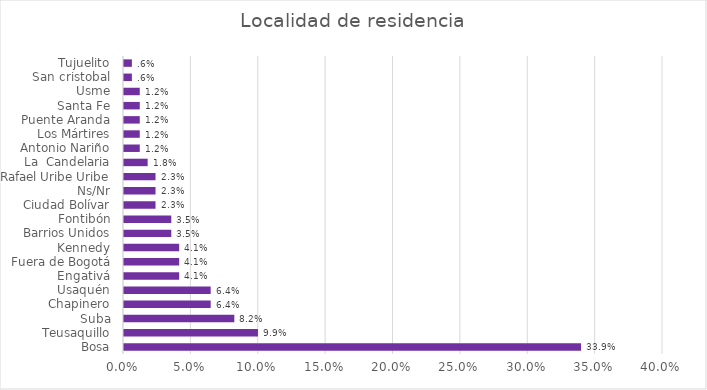
| Category | % del N de columna |
|---|---|
| Bosa | 0.339 |
| Teusaquillo | 0.099 |
| Suba | 0.082 |
| Chapinero | 0.064 |
| Usaquén | 0.064 |
| Engativá | 0.041 |
| Fuera de Bogotá | 0.041 |
| Kennedy | 0.041 |
| Barrios Unidos | 0.035 |
| Fontibón | 0.035 |
| Ciudad Bolívar | 0.023 |
| Ns/Nr | 0.023 |
| Rafael Uribe Uribe | 0.023 |
| La  Candelaria | 0.018 |
| Antonio Nariño | 0.012 |
| Los Mártires | 0.012 |
| Puente Aranda | 0.012 |
| Santa Fe | 0.012 |
| Usme | 0.012 |
| San cristobal | 0.006 |
| Tujuelito | 0.006 |